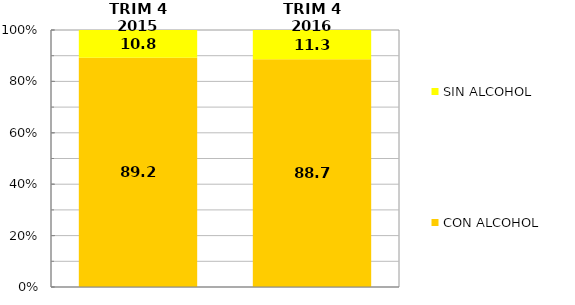
| Category | CON ALCOHOL | SIN ALCOHOL |
|---|---|---|
| TRIM 4 2015 | 89.198 | 10.802 |
| TRIM 4 2016 | 88.655 | 11.345 |